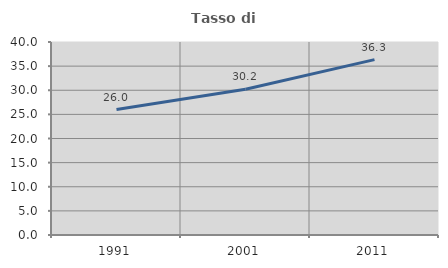
| Category | Tasso di occupazione   |
|---|---|
| 1991.0 | 25.994 |
| 2001.0 | 30.207 |
| 2011.0 | 36.341 |